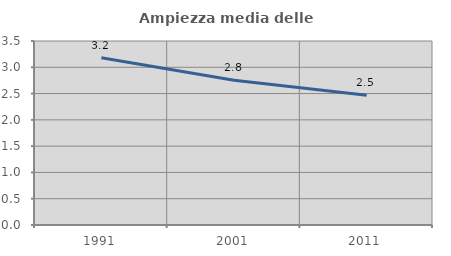
| Category | Ampiezza media delle famiglie |
|---|---|
| 1991.0 | 3.183 |
| 2001.0 | 2.753 |
| 2011.0 | 2.467 |